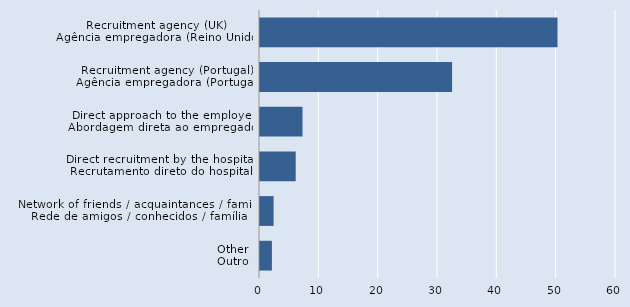
| Category | Series 0 |
|---|---|
| Recruitment agency (UK)
Agência empregadora (Reino Unido) | 50.143 |
| Recruitment agency (Portugal)
Agência empregadora (Portugal) | 32.378 |
| Direct approach to the employer
Abordagem direta ao empregador | 7.163 |
| Direct recruitment by the hospital
Recrutamento direto do hospital | 6.017 |
| Network of friends / acquaintances / family
Rede de amigos / conhecidos / família | 2.292 |
| Other
Outro | 2.006 |